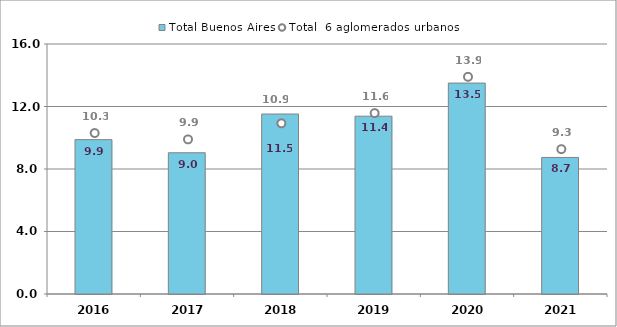
| Category | Total Buenos Aires |
|---|---|
| 2016.0 | 9.88 |
| 2017.0 | 9.04 |
| 2018.0 | 11.52 |
| 2019.0 | 11.38 |
| 2020.0 | 13.5 |
| 2021.0 | 8.74 |